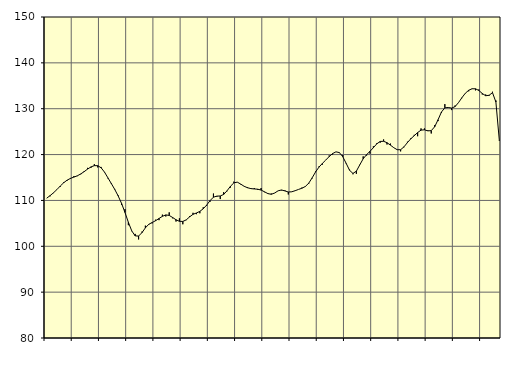
| Category | Piggar | Samtliga anställda (inkl. anställda utomlands) |
|---|---|---|
| nan | 110.5 | 110.49 |
| 87.0 | 110.9 | 111.05 |
| 87.0 | 111.6 | 111.67 |
| 87.0 | 112.4 | 112.37 |
| nan | 113 | 113.15 |
| 88.0 | 114 | 113.86 |
| 88.0 | 114.3 | 114.42 |
| 88.0 | 114.7 | 114.81 |
| nan | 115.3 | 115.09 |
| 89.0 | 115.3 | 115.37 |
| 89.0 | 115.7 | 115.78 |
| 89.0 | 116.4 | 116.27 |
| nan | 117.1 | 116.83 |
| 90.0 | 117.1 | 117.31 |
| 90.0 | 117.9 | 117.58 |
| 90.0 | 117.2 | 117.58 |
| nan | 117.3 | 117.11 |
| 91.0 | 116.1 | 116.16 |
| 91.0 | 114.8 | 114.91 |
| 91.0 | 113.8 | 113.67 |
| nan | 112.5 | 112.4 |
| 92.0 | 111.1 | 110.98 |
| 92.0 | 109 | 109.35 |
| 92.0 | 108.1 | 107.38 |
| nan | 104.6 | 105.23 |
| 93.0 | 103.3 | 103.35 |
| 93.0 | 102.7 | 102.27 |
| 93.0 | 101.5 | 102.23 |
| nan | 103.2 | 102.98 |
| 94.0 | 104.5 | 104.02 |
| 94.0 | 104.7 | 104.8 |
| 94.0 | 105 | 105.19 |
| nan | 105.8 | 105.58 |
| 95.0 | 105.7 | 106.06 |
| 95.0 | 106.9 | 106.53 |
| 95.0 | 106.5 | 106.84 |
| nan | 107.4 | 106.73 |
| 96.0 | 106.1 | 106.28 |
| 96.0 | 105.4 | 105.79 |
| 96.0 | 106.1 | 105.44 |
| nan | 104.8 | 105.42 |
| 97.0 | 105.7 | 105.76 |
| 97.0 | 106.6 | 106.42 |
| 97.0 | 107.3 | 106.97 |
| nan | 107 | 107.26 |
| 98.0 | 107.2 | 107.61 |
| 98.0 | 108.5 | 108.18 |
| 98.0 | 108.8 | 108.98 |
| nan | 109.7 | 109.96 |
| 99.0 | 111.5 | 110.71 |
| 99.0 | 110.8 | 110.94 |
| 99.0 | 110.3 | 110.97 |
| nan | 111.8 | 111.3 |
| 0.0 | 112 | 112.11 |
| 0.0 | 112.8 | 113.09 |
| 0.0 | 114.1 | 113.83 |
| nan | 114 | 113.99 |
| 1.0 | 113.5 | 113.57 |
| 1.0 | 113.1 | 113.09 |
| 1.0 | 112.9 | 112.77 |
| nan | 112.5 | 112.58 |
| 2.0 | 112.7 | 112.5 |
| 2.0 | 112.3 | 112.45 |
| 2.0 | 112.7 | 112.26 |
| nan | 111.8 | 111.88 |
| 3.0 | 111.4 | 111.49 |
| 3.0 | 111.5 | 111.34 |
| 3.0 | 111.6 | 111.62 |
| nan | 112.1 | 112.1 |
| 4.0 | 112.2 | 112.28 |
| 4.0 | 112.2 | 112.07 |
| 4.0 | 111.3 | 111.84 |
| nan | 111.9 | 111.88 |
| 5.0 | 112.1 | 112.12 |
| 5.0 | 112.4 | 112.4 |
| 5.0 | 112.8 | 112.66 |
| nan | 113.1 | 113.04 |
| 6.0 | 113.6 | 113.76 |
| 6.0 | 114.8 | 114.92 |
| 6.0 | 116.3 | 116.2 |
| nan | 117.4 | 117.25 |
| 7.0 | 117.8 | 118.06 |
| 7.0 | 118.8 | 118.8 |
| 7.0 | 119.8 | 119.56 |
| nan | 120 | 120.21 |
| 8.0 | 120.6 | 120.6 |
| 8.0 | 120.5 | 120.43 |
| 8.0 | 119.9 | 119.54 |
| nan | 118 | 118.09 |
| 9.0 | 116.7 | 116.57 |
| 9.0 | 115.7 | 115.88 |
| 9.0 | 115.8 | 116.39 |
| nan | 117.8 | 117.75 |
| 10.0 | 119.6 | 119.08 |
| 10.0 | 119.8 | 119.98 |
| 10.0 | 120.2 | 120.71 |
| nan | 121.8 | 121.5 |
| 11.0 | 122.5 | 122.34 |
| 11.0 | 122.6 | 122.86 |
| 11.0 | 123.3 | 122.9 |
| nan | 122.2 | 122.59 |
| 12.0 | 122.4 | 122.06 |
| 12.0 | 121.5 | 121.5 |
| 12.0 | 121.1 | 121.06 |
| nan | 120.7 | 121.06 |
| 13.0 | 121.6 | 121.69 |
| 13.0 | 122.8 | 122.61 |
| 13.0 | 123.6 | 123.44 |
| nan | 124.3 | 124.12 |
| 14.0 | 124 | 124.8 |
| 14.0 | 125.7 | 125.33 |
| 14.0 | 125.7 | 125.4 |
| nan | 125.3 | 125.17 |
| 15.0 | 124.6 | 125.22 |
| 15.0 | 126.4 | 126.05 |
| 15.0 | 127.3 | 127.59 |
| nan | 129.1 | 129.28 |
| 16.0 | 131 | 130.19 |
| 16.0 | 130.3 | 130.27 |
| 16.0 | 129.7 | 130.14 |
| nan | 130.7 | 130.45 |
| 17.0 | 131.3 | 131.32 |
| 17.0 | 132.3 | 132.39 |
| 17.0 | 133.4 | 133.36 |
| nan | 133.8 | 134.02 |
| 18.0 | 134.3 | 134.35 |
| 18.0 | 134 | 134.35 |
| 18.0 | 134.2 | 133.97 |
| nan | 133.1 | 133.32 |
| 19.0 | 133.1 | 132.83 |
| 19.0 | 132.8 | 132.93 |
| 19.0 | 133.7 | 133.5 |
| nan | 131.8 | 131.46 |
| 20.0 | 123 | 123.14 |